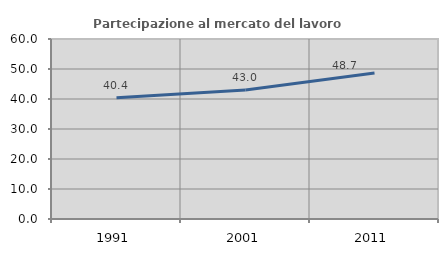
| Category | Partecipazione al mercato del lavoro  femminile |
|---|---|
| 1991.0 | 40.4 |
| 2001.0 | 43.019 |
| 2011.0 | 48.693 |